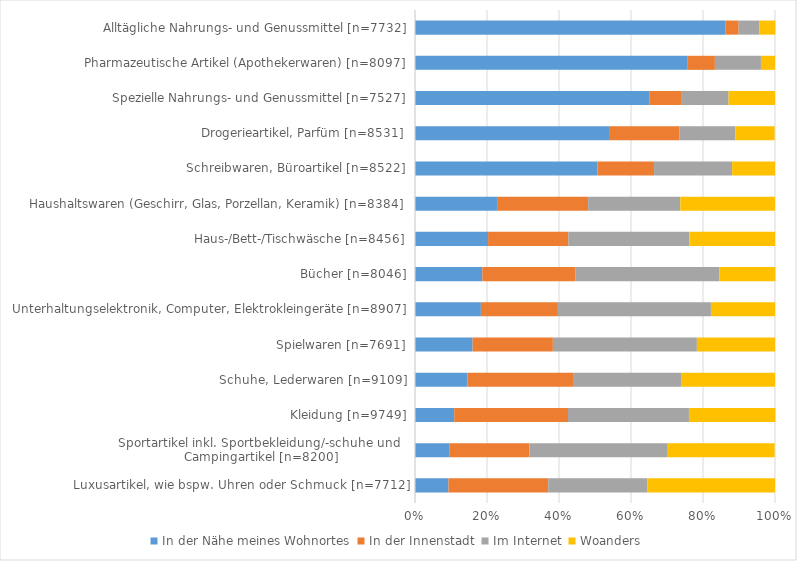
| Category | In der Nähe meines Wohnortes | In der Innenstadt | Im Internet | Woanders |
|---|---|---|---|---|
| Luxusartikel, wie bspw. Uhren oder Schmuck [n=7712] | 0.093 | 0.277 | 0.276 | 0.354 |
| Sportartikel inkl. Sportbekleidung/-schuhe und 
Campingartikel [n=8200] | 0.095 | 0.223 | 0.384 | 0.297 |
| Kleidung [n=9749] | 0.109 | 0.316 | 0.336 | 0.24 |
| Schuhe, Lederwaren [n=9109] | 0.146 | 0.293 | 0.3 | 0.261 |
| Spielwaren [n=7691] | 0.16 | 0.223 | 0.4 | 0.217 |
| Unterhaltungselektronik, Computer, Elektrokleingeräte [n=8907] | 0.183 | 0.214 | 0.425 | 0.178 |
| Bücher [n=8046] | 0.187 | 0.258 | 0.401 | 0.155 |
| Haus-/Bett-/Tischwäsche [n=8456] | 0.203 | 0.223 | 0.336 | 0.238 |
| Haushaltswaren (Geschirr, Glas, Porzellan, Keramik) [n=8384] | 0.228 | 0.253 | 0.256 | 0.263 |
| Schreibwaren, Büroartikel [n=8522] | 0.507 | 0.157 | 0.217 | 0.119 |
| Drogerieartikel, Parfüm [n=8531] | 0.539 | 0.195 | 0.156 | 0.109 |
| Spezielle Nahrungs- und Genussmittel [n=7527] | 0.652 | 0.087 | 0.132 | 0.129 |
| Pharmazeutische Artikel (Apothekerwaren) [n=8097] | 0.756 | 0.077 | 0.128 | 0.039 |
| Alltägliche Nahrungs- und Genussmittel [n=7732] | 0.862 | 0.037 | 0.058 | 0.044 |